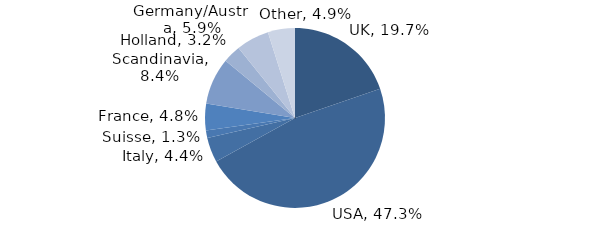
| Category | Investment Style |
|---|---|
| UK | 0.197 |
| USA | 0.473 |
| Italy | 0.044 |
| Suisse | 0.013 |
| France | 0.048 |
| Scandinavia | 0.084 |
| Holland | 0.032 |
| Germany/Austria | 0.059 |
| Other | 0.049 |